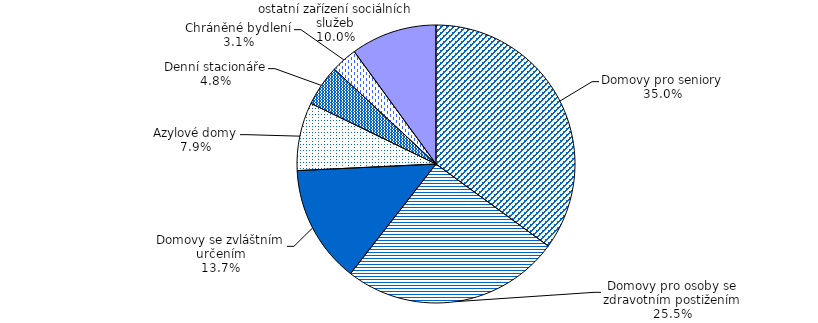
| Category | Series 0 |
|---|---|
| Domovy pro seniory | 816 |
| Domovy pro osoby se zdravotním postižením | 594 |
| Domovy se zvláštním určením | 319 |
| Azylové domy | 185 |
| Denní stacionáře | 111 |
| Chráněné bydlení | 71 |
| ostatní zařízení sociálních služeb | 233 |